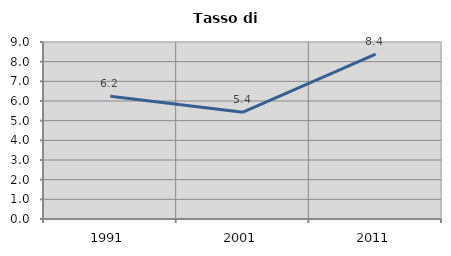
| Category | Tasso di disoccupazione   |
|---|---|
| 1991.0 | 6.237 |
| 2001.0 | 5.431 |
| 2011.0 | 8.378 |